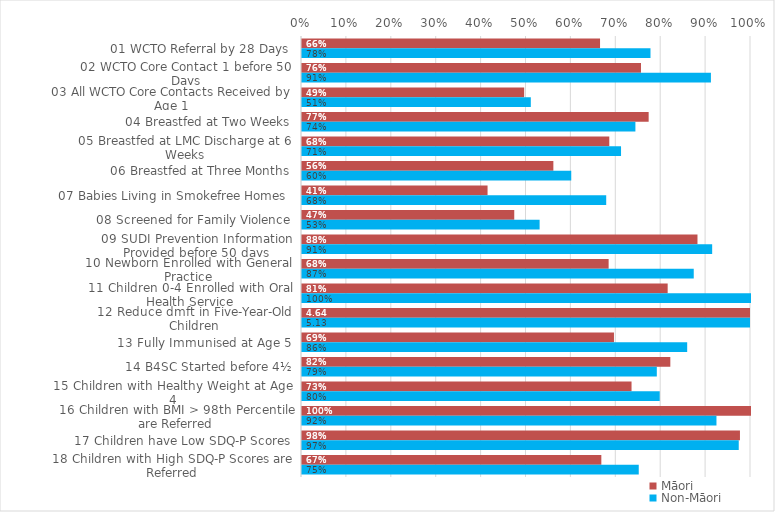
| Category | Māori | Non-Māori |
|---|---|---|
| 01 WCTO Referral by 28 Days | 0.664 | 0.776 |
| 02 WCTO Core Contact 1 before 50 Days | 0.755 | 0.911 |
| 03 All WCTO Core Contacts Received by Age 1 | 0.495 | 0.51 |
| 04 Breastfed at Two Weeks | 0.772 | 0.743 |
| 05 Breastfed at LMC Discharge at 6 Weeks | 0.684 | 0.711 |
| 06 Breastfed at Three Months | 0.56 | 0.6 |
| 07 Babies Living in Smokefree Homes  | 0.413 | 0.678 |
| 08 Screened for Family Violence | 0.473 | 0.529 |
| 09 SUDI Prevention Information Provided before 50 days | 0.881 | 0.914 |
| 10 Newborn Enrolled with General Practice | 0.683 | 0.872 |
| 11 Children 0-4 Enrolled with Oral Health Service | 0.814 | 1 |
| 12 Reduce dmft in Five-Year-Old Children | 4.645 | 5.133 |
| 13 Fully Immunised at Age 5 | 0.695 | 0.858 |
| 14 B4SC Started before 4½ | 0.82 | 0.79 |
| 15 Children with Healthy Weight at Age 4 | 0.734 | 0.797 |
| 16 Children with BMI > 98th Percentile are Referred | 1 | 0.923 |
| 17 Children have Low SDQ-P Scores | 0.975 | 0.973 |
| 18 Children with High SDQ-P Scores are Referred | 0.667 | 0.75 |